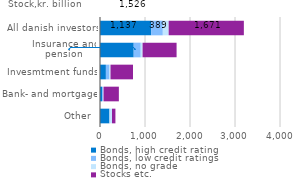
| Category | Bonds, high credit rating  | Bonds, low credit ratings | Bonds, no grade | Stocks etc.  |
|---|---|---|---|---|
| Other  | 209.693 | 2.652 | 54.893 | 75.435 |
| Bank- and mortgage | 46.781 | 20.88 | 11.162 | 340.397 |
| Invesmtment funds | 130.943 | 79.487 | 23.348 | 499.19 |
| Insurance and pension | 749.304 | 156.125 | 40.703 | 755.714 |
| All danish investors | 1136.722 | 259.144 | 130.107 | 1670.736 |